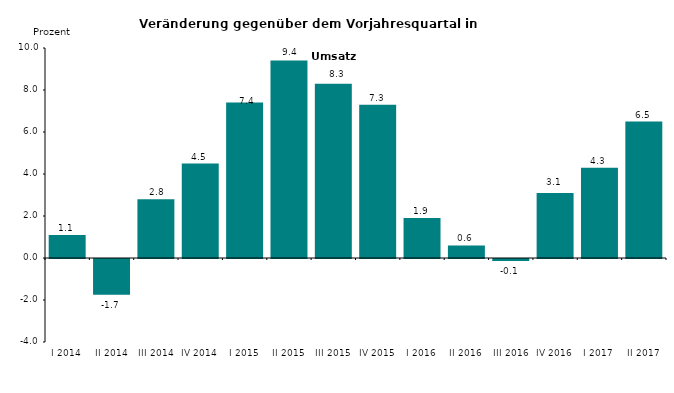
| Category | Series 0 |
|---|---|
| I 2014 | 1.1 |
| II 2014 | -1.7 |
| III 2014 | 2.8 |
| IV 2014 | 4.5 |
| I 2015 | 7.4 |
| II 2015 | 9.4 |
| III 2015 | 8.3 |
| IV 2015 | 7.3 |
| I 2016 | 1.9 |
| II 2016 | 0.6 |
| III 2016 | -0.1 |
| IV 2016 | 3.1 |
| I 2017 | 4.3 |
| II 2017 | 6.5 |